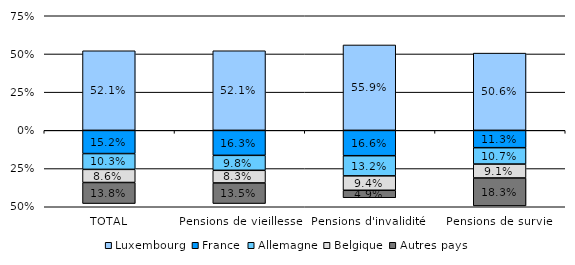
| Category | Luxembourg | France | Allemagne | Belgique | Autres pays |
|---|---|---|---|---|---|
| TOTAL | 0.521 | -0.152 | -0.103 | -0.086 | -0.138 |
| Pensions de vieillesse | 0.521 | -0.163 | -0.098 | -0.083 | -0.135 |
| Pensions d'invalidité  | 0.559 | -0.166 | -0.132 | -0.094 | -0.049 |
| Pensions de survie  | 0.506 | -0.113 | -0.107 | -0.091 | -0.183 |